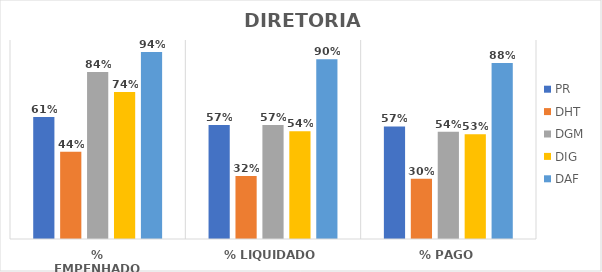
| Category | PR | DHT | DGM | DIG | DAF |
|---|---|---|---|---|---|
| % EMPENHADO | 0.614 | 0.439 | 0.84 | 0.739 | 0.94 |
| % LIQUIDADO | 0.573 | 0.317 | 0.572 | 0.542 | 0.903 |
| % PAGO | 0.565 | 0.303 | 0.539 | 0.527 | 0.885 |